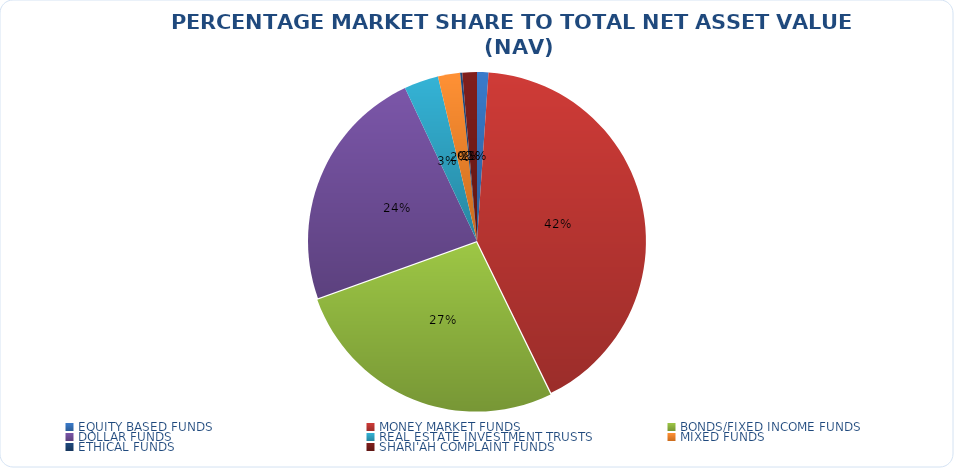
| Category | NET ASSET VALUE |
|---|---|
| EQUITY BASED FUNDS | 15202748443.17 |
| MONEY MARKET FUNDS | 580575777604.53 |
| BONDS/FIXED INCOME FUNDS | 372587304659.86 |
| DOLLAR FUNDS | 327170356300.515 |
| REAL ESTATE INVESTMENT TRUSTS | 45845894907.31 |
| MIXED FUNDS | 29481224740.194 |
| ETHICAL FUNDS | 2818289248.13 |
| SHARI'AH COMPLAINT FUNDS | 19409938016.5 |